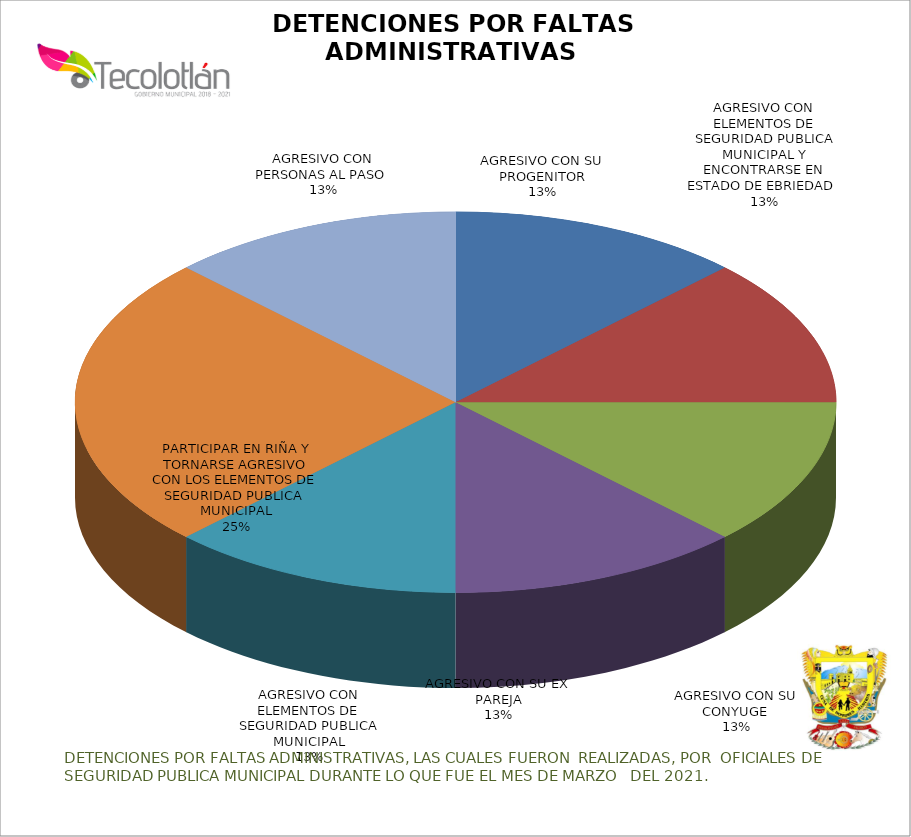
| Category | CANTIDAD |
|---|---|
| AGRESIVO CON SU PROGENITOR | 1 |
| AGRESIVO CON ELEMENTOS DE SEGURIDAD PUBLICA MUNICIPAL Y ENCONTRARSE EN ESTADO DE EBRIEDAD  | 1 |
| AGRESIVO CON SU CONYUGE  | 1 |
| AGRESIVO CON SU EX PAREJA | 1 |
| AGRESIVO CON ELEMENTOS DE SEGURIDAD PUBLICA MUNICIPAL | 1 |
| PARTICIPAR EN RIÑA Y TORNARSE AGRESIVO CON LOS ELEMENTOS DE SEGURIDAD PUBLICA  MUNICIPAL | 2 |
| AGRESIVO CON PERSONAS AL PASO  | 1 |